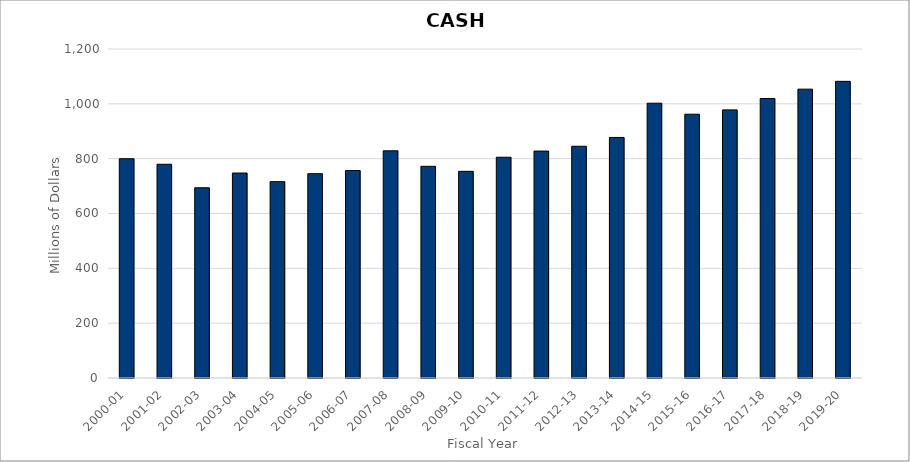
| Category | CASH |
|---|---|
| 2000-01 | 799.8 |
| 2001-02 | 779.571 |
| 2002-03 | 693.782 |
| 2003-04 | 747.625 |
| 2004-05 | 716.148 |
| 2005-06 | 745.245 |
| 2006-07 | 756.553 |
| 2007-08 | 828.628 |
| 2008-09 | 772.165 |
| 2009-10 | 753.778 |
| 2010-11 | 805.214 |
| 2011-12 | 827.682 |
| 2012-13 | 845.258 |
| 2013-14 | 877.423 |
| 2014-15 | 1002.259 |
| 2015-16 | 962.234 |
| 2016-17 | 977.927 |
| 2017-18 | 1019.323 |
| 2018-19 | 1053.588 |
| 2019-20 | 1082.038 |